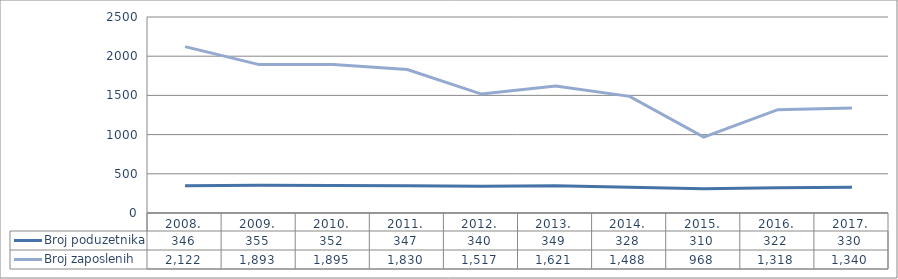
| Category | Broj poduzetnika | Broj zaposlenih |
|---|---|---|
| 2008. | 346 | 2122 |
| 2009. | 355 | 1893 |
| 2010. | 352 | 1895 |
| 2011. | 347 | 1830 |
| 2012. | 340 | 1517 |
| 2013. | 349 | 1621 |
| 2014. | 328 | 1488 |
| 2015. | 310 | 968 |
| 2016. | 322 | 1318 |
| 2017. | 330 | 1340 |